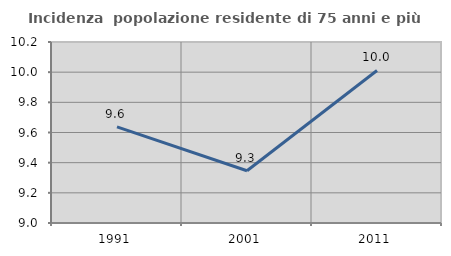
| Category | Incidenza  popolazione residente di 75 anni e più |
|---|---|
| 1991.0 | 9.637 |
| 2001.0 | 9.346 |
| 2011.0 | 10.011 |